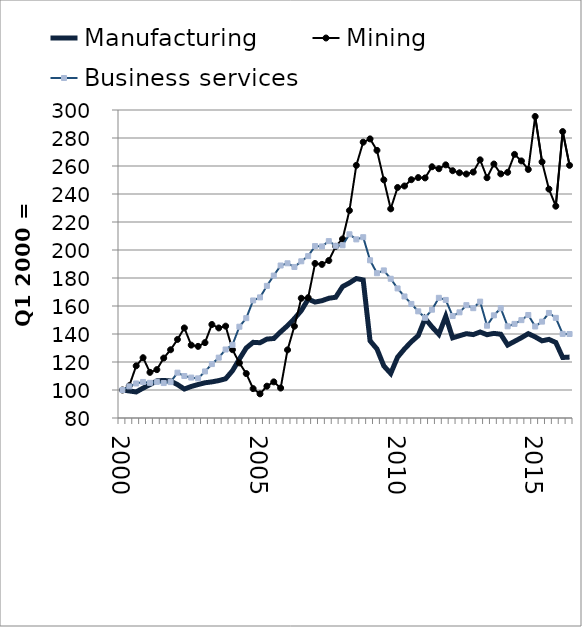
| Category | Manufacturing | Mining | Business services |
|---|---|---|---|
| 2000.0 | 100 | 100 | 100 |
| nan | 99.317 | 103.103 | 102.608 |
| nan | 98.613 | 117.257 | 104.654 |
| nan | 101.342 | 123.054 | 105.746 |
| 2001.0 | 103.833 | 112.608 | 105.131 |
| nan | 106.528 | 114.544 | 105.802 |
| nan | 106.831 | 122.824 | 104.958 |
| nan | 106.451 | 128.73 | 105.643 |
| 2002.0 | 103.87 | 136.104 | 112.385 |
| nan | 100.682 | 144.328 | 109.997 |
| nan | 102.528 | 132.059 | 108.88 |
| nan | 103.92 | 131.166 | 108.325 |
| 2003.0 | 105.152 | 133.847 | 113.253 |
| nan | 105.805 | 146.791 | 118.518 |
| nan | 106.73 | 144.328 | 123.107 |
| nan | 108.023 | 145.612 | 128.931 |
| 2004.0 | 113.769 | 128.796 | 132.248 |
| nan | 122.095 | 119.346 | 145.208 |
| nan | 130.033 | 111.746 | 151.322 |
| nan | 134.045 | 100.984 | 163.956 |
| 2005.0 | 133.765 | 97.256 | 166.14 |
| nan | 136.352 | 102.729 | 174.364 |
| nan | 136.8 | 105.812 | 181.723 |
| nan | 141.543 | 101.397 | 188.92 |
| 2006.0 | 145.942 | 128.648 | 190.508 |
| nan | 150.992 | 145.57 | 187.873 |
| nan | 156.689 | 165.532 | 191.924 |
| nan | 164.911 | 165.918 | 195.631 |
| 2007.0 | 162.82 | 190.366 | 202.812 |
| nan | 163.785 | 189.726 | 202.545 |
| nan | 165.515 | 192.478 | 206.342 |
| nan | 166.255 | 202.557 | 202.974 |
| 2008.0 | 173.853 | 207.854 | 203.359 |
| nan | 176.492 | 228.187 | 211.232 |
| nan | 179.622 | 260.465 | 207.589 |
| nan | 178.611 | 277.012 | 209.133 |
| 2009.0 | 135.116 | 279.362 | 192.649 |
| nan | 129.318 | 271.165 | 183.419 |
| nan | 117.178 | 250.109 | 185.423 |
| nan | 111.808 | 229.405 | 179.463 |
| 2010.0 | 123.45 | 244.66 | 172.555 |
| nan | 129.336 | 245.71 | 166.818 |
| nan | 134.464 | 250.23 | 161.486 |
| nan | 138.844 | 251.733 | 156.191 |
| 2011.0 | 151.068 | 251.483 | 151.576 |
| nan | 145.091 | 259.443 | 157.366 |
| nan | 139.787 | 258.053 | 165.842 |
| nan | 152.589 | 260.817 | 164.335 |
| 2012.0 | 137.248 | 256.64 | 152.824 |
| nan | 138.748 | 255.168 | 155.47 |
| nan | 140.232 | 254.278 | 160.592 |
| nan | 139.57 | 255.664 | 158.447 |
| 2013.0 | 141.442 | 264.404 | 163.119 |
| nan | 139.497 | 251.632 | 145.935 |
| nan | 140.438 | 261.418 | 153.327 |
| nan | 139.834 | 254.364 | 158.362 |
| 2014.0 | 132.108 | 255.5 | 145.483 |
| nan | 134.741 | 268.296 | 147.21 |
| nan | 137.364 | 263.623 | 149.904 |
| nan | 140.253 | 257.522 | 153.578 |
| 2015.0 | 137.933 | 295.37 | 145.383 |
| nan | 135.136 | 262.932 | 148.85 |
| nan | 136.143 | 243.512 | 155.03 |
| nan | 133.929 | 231.302 | 151.524 |
| 2016.0 | 123.223 | 284.605 | 140.099 |
| nan | 123.506 | 260.473 | 139.989 |